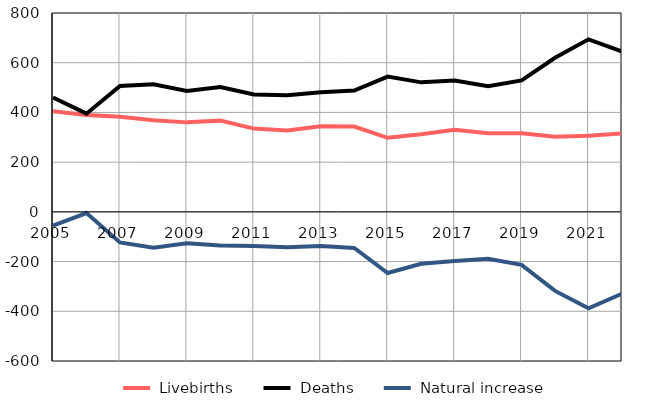
| Category |  Livebirths |  Deaths |  Natural increase |
|---|---|---|---|
| 2005.0 | 405 | 460 | -55 |
| 2006.0 | 390 | 395 | -5 |
| 2007.0 | 383 | 506 | -123 |
| 2008.0 | 369 | 513 | -144 |
| 2009.0 | 360 | 486 | -126 |
| 2010.0 | 367 | 502 | -135 |
| 2011.0 | 335 | 472 | -137 |
| 2012.0 | 327 | 469 | -142 |
| 2013.0 | 344 | 481 | -137 |
| 2014.0 | 343 | 488 | -145 |
| 2015.0 | 298 | 544 | -246 |
| 2016.0 | 312 | 521 | -209 |
| 2017.0 | 330 | 528 | -198 |
| 2018.0 | 316 | 505 | -189 |
| 2019.0 | 316 | 529 | -213 |
| 2020.0 | 302 | 620 | -318 |
| 2021.0 | 306 | 694 | -388 |
| 2022.0 | 316 | 645 | -329 |